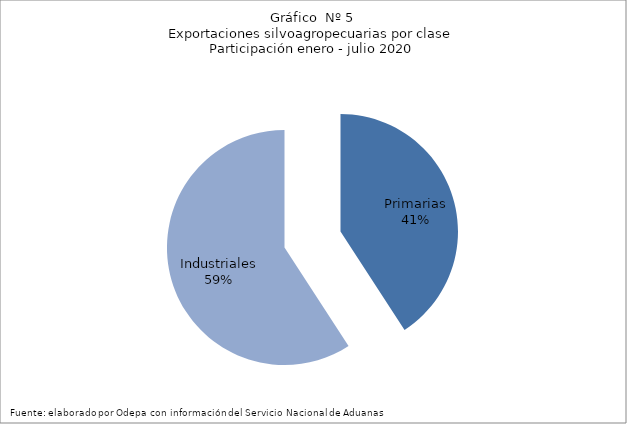
| Category | Series 0 |
|---|---|
| Primarias | 6208705 |
| Industriales | 8999753 |